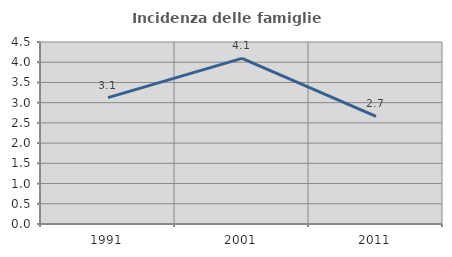
| Category | Incidenza delle famiglie numerose |
|---|---|
| 1991.0 | 3.125 |
| 2001.0 | 4.096 |
| 2011.0 | 2.664 |